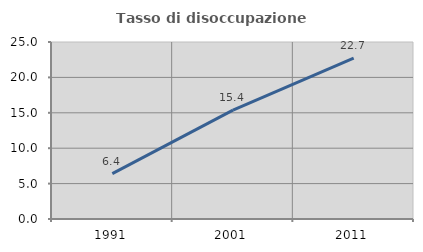
| Category | Tasso di disoccupazione giovanile  |
|---|---|
| 1991.0 | 6.41 |
| 2001.0 | 15.385 |
| 2011.0 | 22.727 |